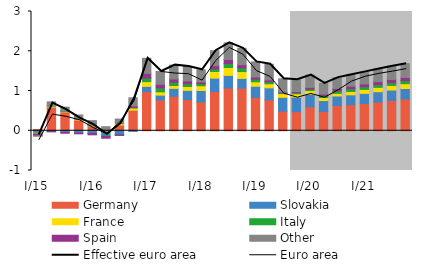
| Category | Germany | Slovakia | France | Italy | Spain | Other |
|---|---|---|---|---|---|---|
| I/15 | 0.031 | -0.064 | -0.016 | -0.007 | -0.042 | -0.005 |
| II | 0.595 | -0.015 | 0.022 | 0.007 | -0.013 | 0.103 |
| III | 0.472 | -0.042 | 0.009 | 0.017 | -0.021 | 0.096 |
| IV | 0.27 | -0.058 | 0.015 | 0.01 | -0.019 | 0.102 |
| I/16 | 0.117 | -0.067 | 0.007 | -0.002 | -0.034 | 0.131 |
| II | -0.038 | -0.091 | 0.007 | -0.016 | -0.044 | 0.095 |
| III | 0.144 | -0.101 | 0.031 | -0.005 | -0.011 | 0.118 |
| IV | 0.518 | -0.017 | 0.052 | 0.015 | 0.036 | 0.208 |
| I/17 | 0.987 | 0.131 | 0.118 | 0.09 | 0.118 | 0.379 |
| II | 0.774 | 0.123 | 0.082 | 0.1 | 0.089 | 0.324 |
| III | 0.867 | 0.198 | 0.074 | 0.083 | 0.081 | 0.348 |
| IV | 0.783 | 0.233 | 0.097 | 0.072 | 0.07 | 0.364 |
| I/18 | 0.729 | 0.284 | 0.12 | 0.052 | 0.046 | 0.302 |
| II | 0.99 | 0.334 | 0.168 | 0.062 | 0.084 | 0.375 |
| III | 1.076 | 0.317 | 0.199 | 0.1 | 0.101 | 0.418 |
| IV | 1.072 | 0.245 | 0.172 | 0.092 | 0.082 | 0.411 |
| I/19 | 0.839 | 0.28 | 0.113 | 0.065 | 0.055 | 0.38 |
| II | 0.777 | 0.303 | 0.103 | 0.051 | 0.049 | 0.39 |
| III | 0.493 | 0.347 | 0.094 | 0.018 | 0.02 | 0.334 |
| IV | 0.479 | 0.368 | 0.082 | 0.027 | 0.029 | 0.299 |
| I/20 | 0.602 | 0.318 | 0.091 | 0.037 | 0.043 | 0.309 |
| II | 0.486 | 0.274 | 0.075 | 0.045 | 0.044 | 0.267 |
| III | 0.635 | 0.24 | 0.065 | 0.062 | 0.062 | 0.274 |
| IV | 0.655 | 0.249 | 0.085 | 0.067 | 0.066 | 0.288 |
| I/21 | 0.687 | 0.254 | 0.098 | 0.068 | 0.071 | 0.303 |
| II | 0.724 | 0.258 | 0.108 | 0.069 | 0.076 | 0.318 |
| III | 0.764 | 0.26 | 0.116 | 0.071 | 0.081 | 0.332 |
| IV | 0.8 | 0.262 | 0.121 | 0.075 | 0.084 | 0.345 |